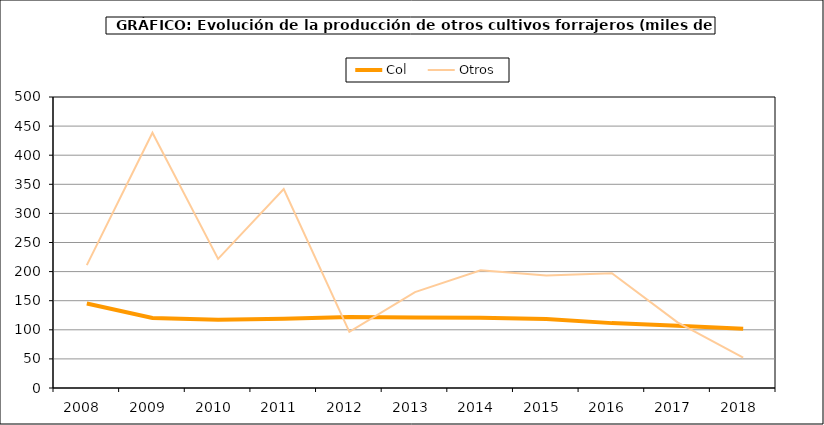
| Category | Col | Otros |
|---|---|---|
| 2008.0 | 145.208 | 211.156 |
| 2009.0 | 120.292 | 438.536 |
| 2010.0 | 117.345 | 221.872 |
| 2011.0 | 118.869 | 341.873 |
| 2012.0 | 122.008 | 96.567 |
| 2013.0 | 121.043 | 164.745 |
| 2014.0 | 120.638 | 202.445 |
| 2015.0 | 118.726 | 193.293 |
| 2016.0 | 111.472 | 197.303 |
| 2017.0 | 107.156 | 112.906 |
| 2018.0 | 101.713 | 52.117 |